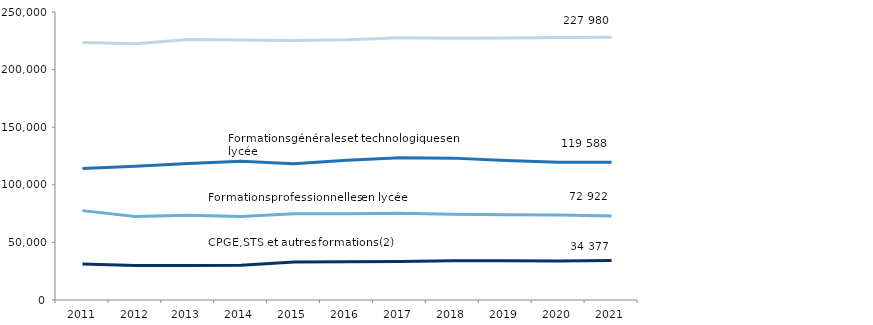
| Category | Formations en collège y compris Segpa | Formations professionnelles au lycée | Formations générales et technologiques en lycée | CPGE, STS et autres formations (2) |
|---|---|---|---|---|
| 2011
 | 223524 | 77584 | 114049 | 31172 |
| 2012
 | 222361 | 72553 | 116045 | 30049 |
| 2013 | 226201 | 73539 | 118498 | 29901 |
| 2014 | 225705 | 72503 | 120399 | 30254 |
| 2015 | 225335 | 74807 | 118351 | 33004 |
| 2016 | 225950 | 74918 | 121242 | 33165 |
| 2017 | 227677 | 75237 | 123507 | 33462 |
| 2018 | 227316 | 74503 | 123154 | 34007 |
| 2019 | 227327 | 74074 | 121020 | 33971 |
| 2020 | 227924 | 73710 | 119509 | 33845 |
| 2021 | 227980 | 72922 | 119588 | 34377 |